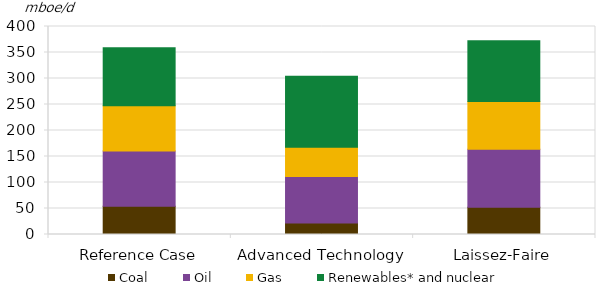
| Category | Coal | Oil | Gas | Renewables* and nuclear |
|---|---|---|---|---|
| Reference Case | 54.388 | 106.07 | 87.029 | 111.734 |
| Advanced Technology | 22.213 | 89.173 | 56.312 | 136.8 |
| Laissez-Faire | 52.165 | 111.721 | 92.092 | 116.682 |